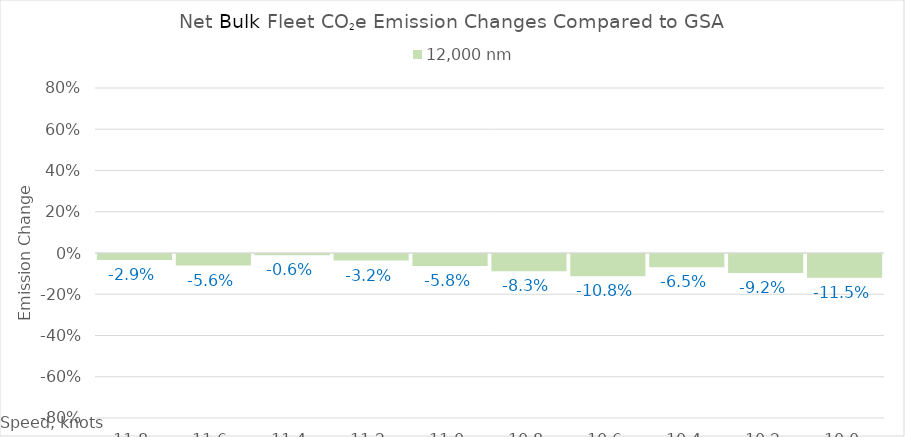
| Category | 12,000 |
|---|---|
| 11.8 | -0.029 |
| 11.600000000000001 | -0.056 |
| 11.400000000000002 | -0.006 |
| 11.200000000000003 | -0.032 |
| 11.000000000000004 | -0.058 |
| 10.800000000000004 | -0.083 |
| 10.600000000000005 | -0.108 |
| 10.400000000000006 | -0.065 |
| 10.200000000000006 | -0.092 |
| 10.000000000000007 | -0.115 |